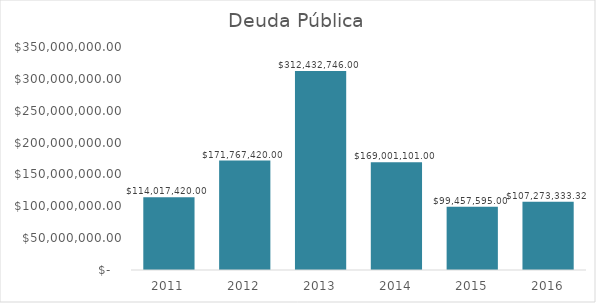
| Category | Deuda Pública |
|---|---|
| 2011.0 | 114017420 |
| 2012.0 | 171767420 |
| 2013.0 | 312432746 |
| 2014.0 | 169001101 |
| 2015.0 | 99457595 |
| 2016.0 | 107273333.32 |